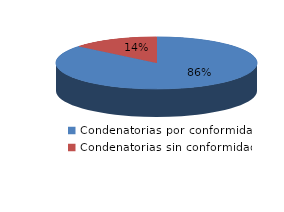
| Category | Series 0 |
|---|---|
| 0 | 1216 |
| 1 | 198 |